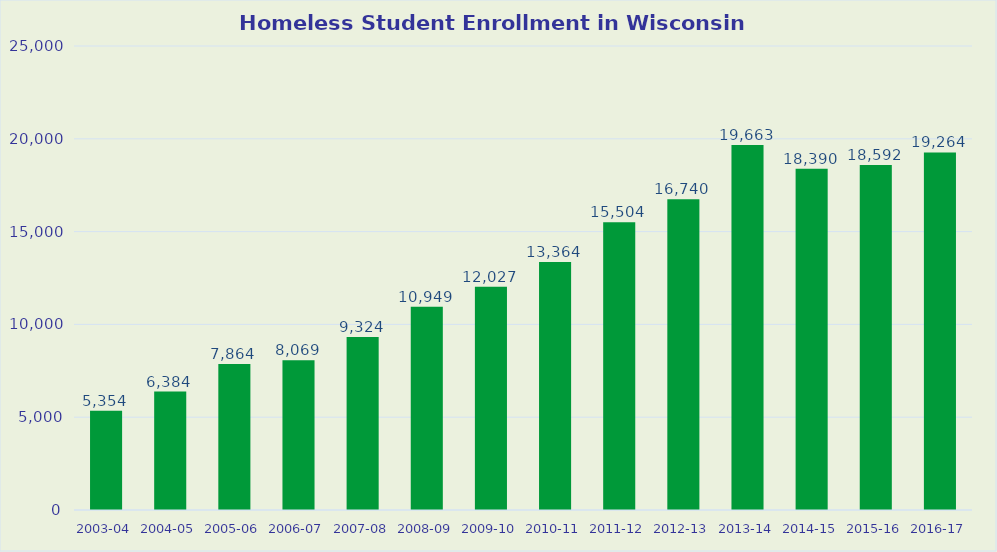
| Category | Series 0 |
|---|---|
| 2003-04 | 5354 |
| 2004-05 | 6384 |
| 2005-06 | 7864 |
| 2006-07 | 8069 |
| 2007-08 | 9324 |
| 2008-09 | 10949 |
| 2009-10 | 12027 |
| 2010-11 | 13364 |
| 2011-12 | 15504 |
| 2012-13 | 16740 |
| 2013-14 | 19663 |
| 2014-15 | 18390 |
| 2015-16 | 18592 |
| 2016-17 | 19264 |